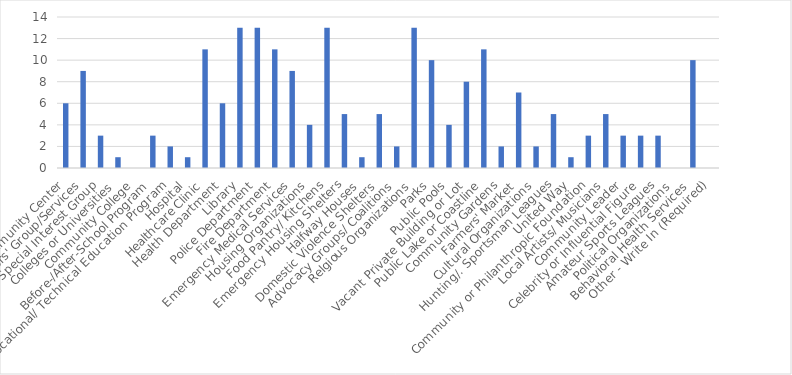
| Category | Number of Responses |
|---|---|
| Community Center | 6 |
| Seniors' Group/Services | 9 |
| Special Interest Group | 3 |
| Colleges or Universities | 1 |
| Community College | 0 |
| Before-/After-School Program | 3 |
| Vocational/ Technical Education Program | 2 |
| Hospital | 1 |
| Healthcare Clinic | 11 |
| Health Department | 6 |
| Library | 13 |
| Police Department | 13 |
| Fire Department | 11 |
| Emergency Medical Services | 9 |
| Housing Organizations | 4 |
| Food Pantry/ Kitchens | 13 |
| Emergency Housing Shelters | 5 |
| Halfway Houses | 1 |
| Domestic Violence Shelters | 5 |
| Advocacy Groups/ Coalitions | 2 |
| Relgious Organizations | 13 |
| Parks | 10 |
| Public Pools | 4 |
| Vacant Private Building or Lot | 8 |
| Public Lake or Coastline | 11 |
| Community Gardens | 2 |
| Farmers' Market | 7 |
| Cultural Organizations | 2 |
| Hunting/. Sportsman Leagues | 5 |
| United Way | 1 |
| Community or Philanthropic Foundation | 3 |
| Local Artists/ Musicians | 5 |
| Community Leader | 3 |
| Celebrity or Influential Figure | 3 |
| Amateur Sports Leagues | 3 |
| Political Organizations | 0 |
| Behavioral Health Services | 10 |
| Other - Write In (Required) | 0 |